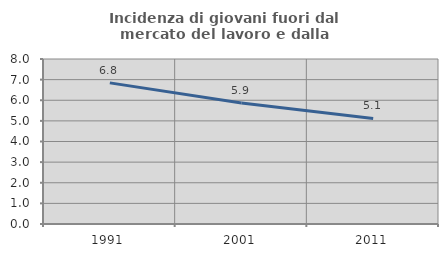
| Category | Incidenza di giovani fuori dal mercato del lavoro e dalla formazione  |
|---|---|
| 1991.0 | 6.842 |
| 2001.0 | 5.867 |
| 2011.0 | 5.119 |